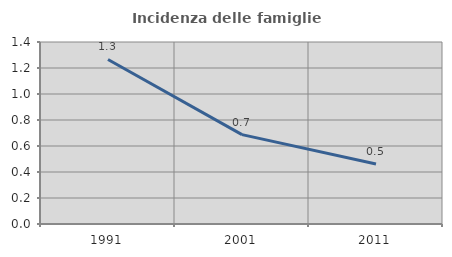
| Category | Incidenza delle famiglie numerose |
|---|---|
| 1991.0 | 1.266 |
| 2001.0 | 0.687 |
| 2011.0 | 0.461 |